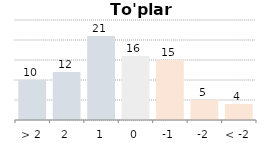
| Category | Goal difference |
|---|---|
| > 2 | 10 |
| 2 | 12 |
| 1 | 21 |
| 0 | 16 |
| -1 | 15 |
| -2 | 5 |
| < -2 | 4 |